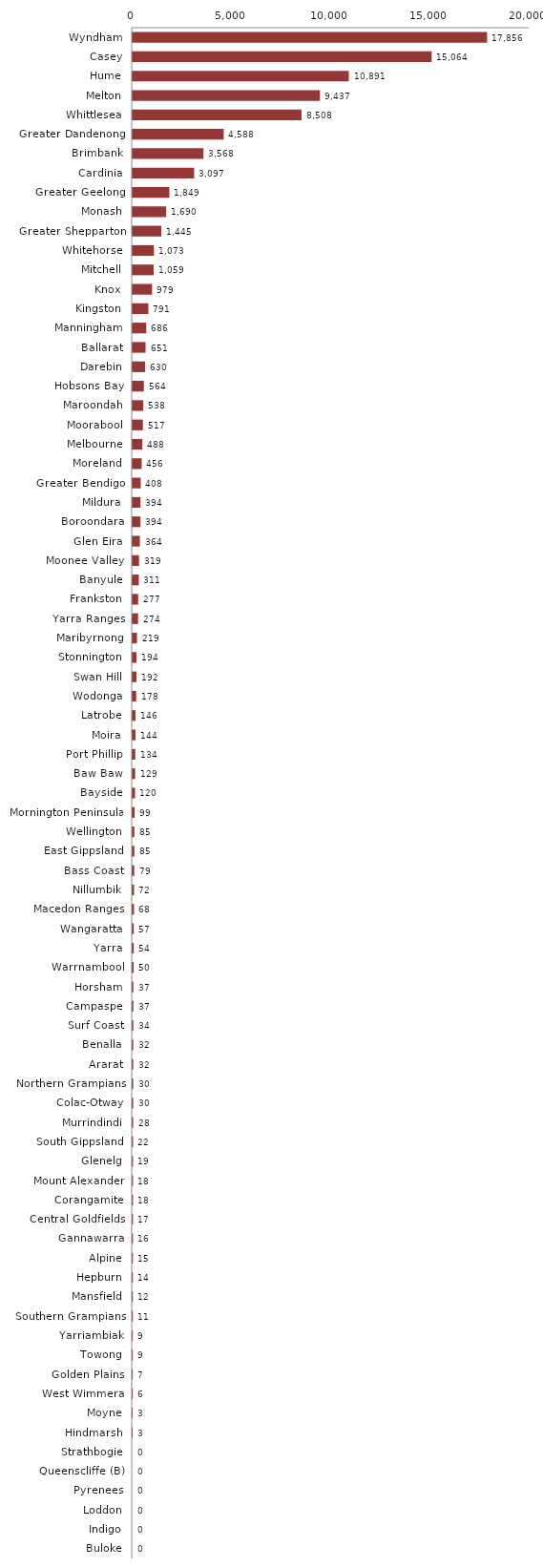
| Category | Series 0 |
|---|---|
| Wyndham | 17856 |
| Casey | 15064 |
| Hume | 10891 |
| Melton | 9437 |
| Whittlesea | 8508 |
| Greater Dandenong | 4588 |
| Brimbank | 3568 |
| Cardinia | 3097 |
| Greater Geelong | 1849 |
| Monash | 1690 |
| Greater Shepparton | 1445 |
| Whitehorse | 1073 |
| Mitchell | 1059 |
| Knox | 979 |
| Kingston | 791 |
| Manningham | 686 |
| Ballarat | 651 |
| Darebin | 630 |
| Hobsons Bay | 564 |
| Maroondah | 538 |
| Moorabool | 517 |
| Melbourne | 488 |
| Moreland | 456 |
| Greater Bendigo | 408 |
| Mildura | 394 |
| Boroondara | 394 |
| Glen Eira | 364 |
| Moonee Valley | 319 |
| Banyule | 311 |
| Frankston | 277 |
| Yarra Ranges | 274 |
| Maribyrnong | 219 |
| Stonnington | 194 |
| Swan Hill | 192 |
| Wodonga | 178 |
| Latrobe | 146 |
| Moira | 144 |
| Port Phillip | 134 |
| Baw Baw | 129 |
| Bayside | 120 |
| Mornington Peninsula | 99 |
| Wellington | 85 |
| East Gippsland | 85 |
| Bass Coast | 79 |
| Nillumbik | 72 |
| Macedon Ranges | 68 |
| Wangaratta | 57 |
| Yarra | 54 |
| Warrnambool | 50 |
| Horsham | 37 |
| Campaspe | 37 |
| Surf Coast | 34 |
| Benalla | 32 |
| Ararat | 32 |
| Northern Grampians | 30 |
| Colac-Otway | 30 |
| Murrindindi | 28 |
| South Gippsland | 22 |
| Glenelg | 19 |
| Mount Alexander | 18 |
| Corangamite | 18 |
| Central Goldfields | 17 |
| Gannawarra | 16 |
| Alpine | 15 |
| Hepburn | 14 |
| Mansfield | 12 |
| Southern Grampians | 11 |
| Yarriambiak | 9 |
| Towong | 9 |
| Golden Plains | 7 |
| West Wimmera | 6 |
| Moyne | 3 |
| Hindmarsh | 3 |
| Strathbogie | 0 |
| Queenscliffe (B) | 0 |
| Pyrenees | 0 |
| Loddon | 0 |
| Indigo | 0 |
| Buloke | 0 |